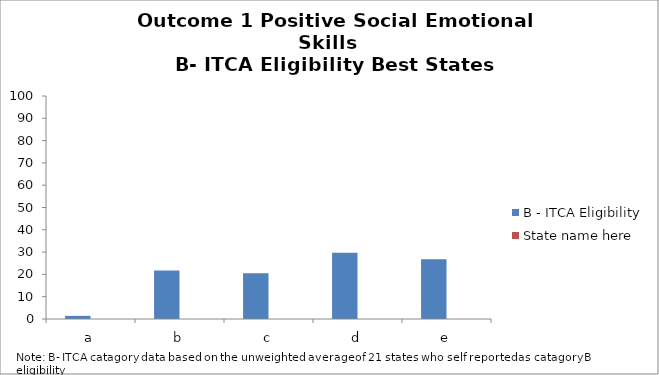
| Category | B - ITCA Eligibility | State name here |
|---|---|---|
| a | 1.4 |  |
| b | 21.7 |  |
| c | 20.5 |  |
| d | 29.7 |  |
| e | 26.8 |  |